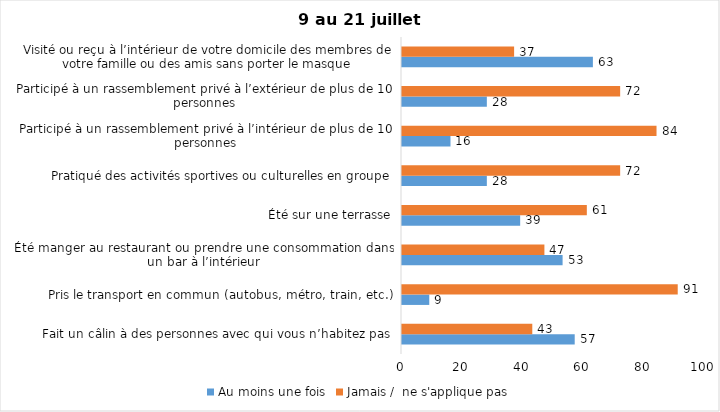
| Category | Au moins une fois | Jamais /  ne s'applique pas |
|---|---|---|
| Fait un câlin à des personnes avec qui vous n’habitez pas | 57 | 43 |
| Pris le transport en commun (autobus, métro, train, etc.) | 9 | 91 |
| Été manger au restaurant ou prendre une consommation dans un bar à l’intérieur | 53 | 47 |
| Été sur une terrasse | 39 | 61 |
| Pratiqué des activités sportives ou culturelles en groupe | 28 | 72 |
| Participé à un rassemblement privé à l’intérieur de plus de 10 personnes | 16 | 84 |
| Participé à un rassemblement privé à l’extérieur de plus de 10 personnes | 28 | 72 |
| Visité ou reçu à l’intérieur de votre domicile des membres de votre famille ou des amis sans porter le masque | 63 | 37 |